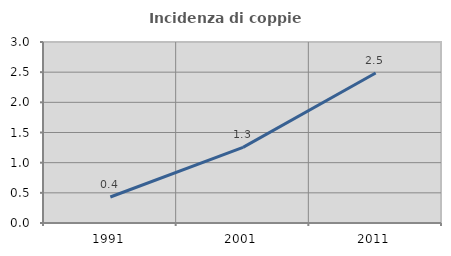
| Category | Incidenza di coppie miste |
|---|---|
| 1991.0 | 0.431 |
| 2001.0 | 1.254 |
| 2011.0 | 2.486 |